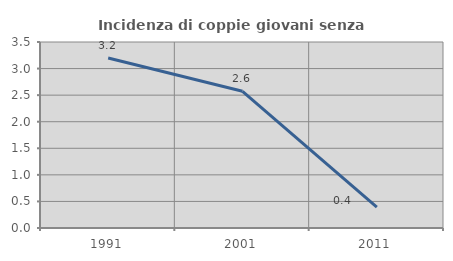
| Category | Incidenza di coppie giovani senza figli |
|---|---|
| 1991.0 | 3.198 |
| 2001.0 | 2.572 |
| 2011.0 | 0.394 |